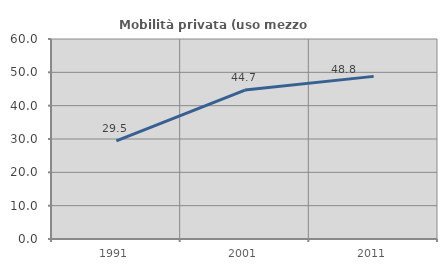
| Category | Mobilità privata (uso mezzo privato) |
|---|---|
| 1991.0 | 29.451 |
| 2001.0 | 44.669 |
| 2011.0 | 48.789 |